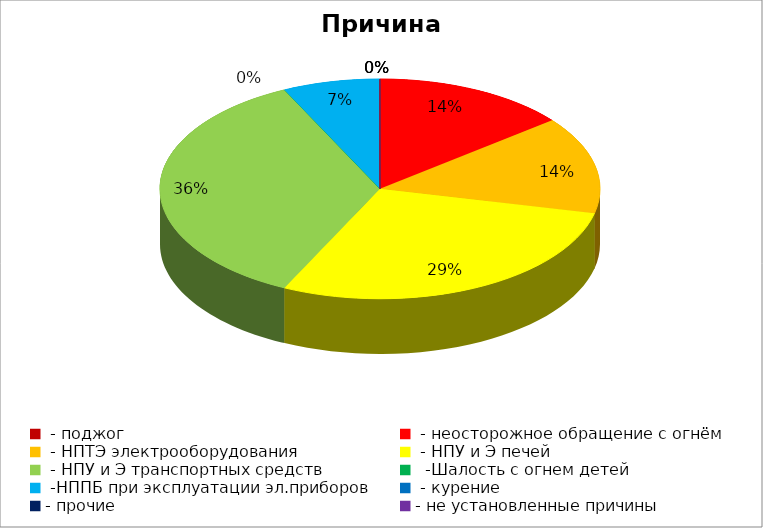
| Category | Причина пожара |
|---|---|
|  - поджог | 0 |
|  - неосторожное обращение с огнём | 2 |
|  - НПТЭ электрооборудования | 2 |
|  - НПУ и Э печей | 4 |
|  - НПУ и Э транспортных средств | 5 |
|   -Шалость с огнем детей | 0 |
|  -НППБ при эксплуатации эл.приборов | 1 |
|  - курение | 0 |
| - прочие | 0 |
| - не установленные причины | 0 |